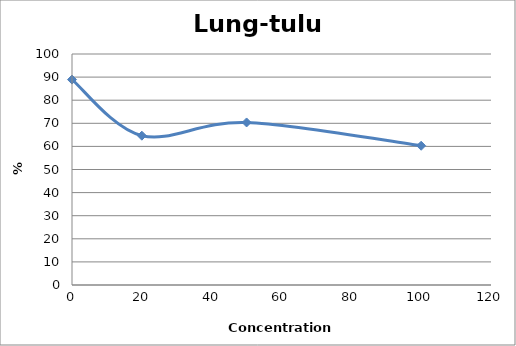
| Category | Lung-tulu4 |
|---|---|
| 100.0 | 60.286 |
| 50.0 | 70.36 |
| 20.0 | 64.64 |
| 0.0 | 88.929 |
| nan | 0 |
| nan | 0 |
| nan | 0 |
| nan | 0 |
| nan | 0 |